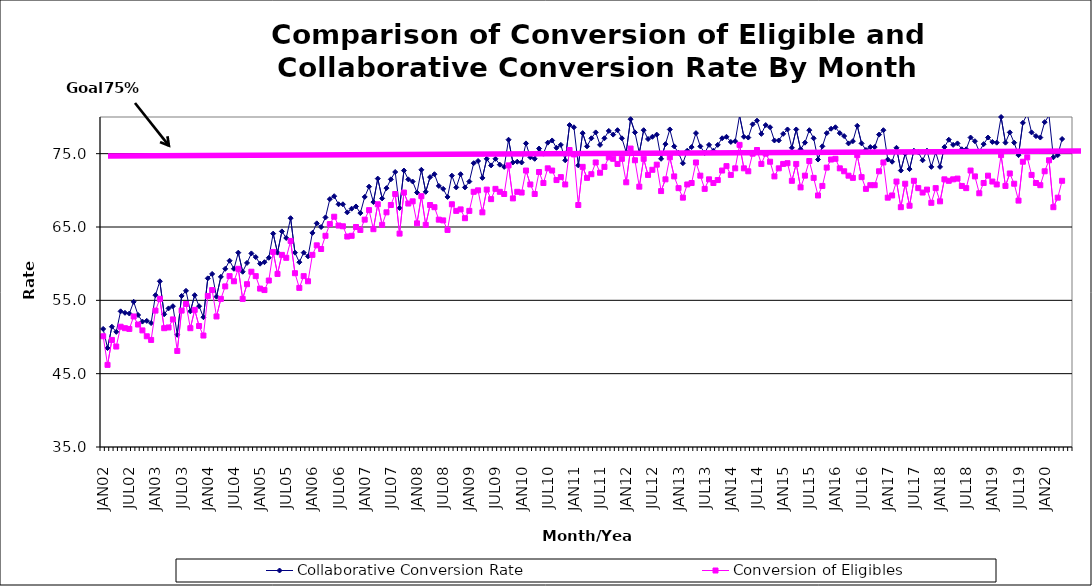
| Category | Collaborative Conversion Rate | Conversion of Eligibles |
|---|---|---|
| JAN02 | 51.1 | 50.1 |
| FEB02 | 48.5 | 46.2 |
| MAR02 | 51.4 | 49.6 |
| APR02 | 50.7 | 48.7 |
| MAY02 | 53.5 | 51.4 |
| JUN02 | 53.3 | 51.2 |
| JUL02 | 53.2 | 51.1 |
| AUG02 | 54.8 | 52.8 |
| SEP02 | 53 | 51.7 |
| OCT02 | 52.1 | 50.9 |
| NOV02 | 52.2 | 50.1 |
| DEC02 | 51.9 | 49.6 |
| JAN03 | 55.7 | 53.6 |
| FEB03 | 57.6 | 55.2 |
| MAR03 | 53.1 | 51.2 |
| APR03 | 53.9 | 51.3 |
| MAY03 | 54.2 | 52.4 |
| JUN03 | 50.3 | 48.1 |
| JUL03 | 55.6 | 53.6 |
| AUG03 | 56.3 | 54.5 |
| SEP03 | 53.5 | 51.2 |
| OCT03 | 55.7 | 53.7 |
| NOV03 | 54.2 | 51.5 |
| DEC03 | 52.7 | 50.2 |
| JAN04 | 58 | 55.6 |
| FEB04 | 58.6 | 56.4 |
| MAR04 | 55.5 | 52.8 |
| APR04 | 58.2 | 55.2 |
| MAY04 | 59.3 | 56.9 |
| JUN04 | 60.4 | 58.3 |
| JUL04 | 59.3 | 57.6 |
| AUG04 | 61.5 | 59.3 |
| SEP04 | 58.9 | 55.2 |
| OCT04 | 60.1 | 57.2 |
| NOV04 | 61.4 | 58.9 |
| DEC04 | 60.9 | 58.3 |
| JAN05 | 60 | 56.6 |
| FEB05 | 60.2 | 56.4 |
| MAR05 | 60.8 | 57.7 |
| APR05 | 64.1 | 61.6 |
| MAY05 | 61.5 | 58.6 |
| JUN05 | 64.4 | 61.2 |
| JUL05 | 63.5 | 60.8 |
| AUG05 | 66.2 | 63.1 |
| SEP05 | 61.5 | 58.7 |
| OCT05 | 60.2 | 56.7 |
| NOV05 | 61.5 | 58.3 |
| DEC05 | 61 | 57.6 |
| JAN06 | 64.2 | 61.2 |
| FEB06 | 65.5 | 62.5 |
| MAR06 | 65 | 62 |
| APR06 | 66.3 | 63.8 |
| MAY06 | 68.8 | 65.4 |
| JUN06 | 69.2 | 66.4 |
| JUL06 | 68.1 | 65.2 |
| AUG06 | 68.1 | 65.1 |
| SEP06 | 67 | 63.7 |
| OCT06 | 67.5 | 63.8 |
| NOV06 | 67.8 | 65 |
| DEC06 | 66.9 | 64.6 |
| JAN07 | 69.1 | 66 |
| FEB07 | 70.5 | 67.3 |
| MAR07 | 68.4 | 64.7 |
| APR07 | 71.6 | 68.1 |
| MAY07 | 68.9 | 65.3 |
| JUN07 | 70.3 | 67 |
| JUL07 | 71.5 | 68 |
| AUG07 | 72.5 | 69.5 |
| SEP07 | 67.6 | 64.1 |
| OCT07 | 72.7 | 69.7 |
| NOV07 | 71.5 | 68.2 |
| DEC07 | 71.2 | 68.5 |
| JAN08 | 69.7 | 65.5 |
| FEB08 | 72.8 | 69.2 |
| MAR08 | 69.8 | 65.3 |
| APR08 | 71.8 | 68 |
| MAY08 | 72.2 | 67.7 |
| JUN08 | 70.6 | 66 |
| JUL08 | 70.2 | 65.9 |
| AUG08 | 69.1 | 64.6 |
| SEP08 | 72 | 68.1 |
| OCT08 | 70.4 | 67.2 |
| NOV08 | 72.2 | 67.4 |
| DEC08 | 70.4 | 66.2 |
| JAN09 | 71.2 | 67.2 |
| FEB09 | 73.7 | 69.8 |
| MAR09 | 74 | 70 |
| APR09 | 71.7 | 67 |
| MAY09 | 74.3 | 70.1 |
| JUN09 | 73.4 | 68.8 |
| JUL09 | 74.3 | 70.2 |
| AUG09 | 73.5 | 69.8 |
| SEP09 | 73.2 | 69.5 |
| OCT09 | 76.9 | 73.4 |
| NOV09 | 73.8 | 68.9 |
| DEC09 | 73.9 | 69.8 |
| JAN10 | 73.8 | 69.7 |
| FEB10 | 76.4 | 72.7 |
| MAR10 | 74.5 | 70.8 |
| APR10 | 74.3 | 69.5 |
| MAY10 | 75.7 | 72.5 |
| JUN10 | 75 | 71 |
| JUL10 | 76.5 | 73 |
| AUG10 | 76.8 | 72.7 |
| SEP10 | 75.8 | 71.4 |
| OCT10 | 76.2 | 71.8 |
| NOV10 | 74.1 | 70.8 |
| DEC10 | 78.9 | 75.5 |
| JAN11 | 78.6 | 74.9 |
| FEB11 | 73.4 | 68 |
| MAR11 | 77.8 | 73.2 |
| APR11 | 76 | 71.7 |
| MAY11 | 77.1 | 72.2 |
| JUN11 | 77.9 | 73.8 |
| JUL11 | 76.2 | 72.4 |
| AUG11 | 77.1 | 73.2 |
| SEP11 | 78.1 | 74.5 |
| OCT11 | 77.6 | 74.3 |
| NOV11 | 78.2 | 73.6 |
| DEC11 | 77.1 | 74.3 |
| JAN12 | 75.2 | 71.1 |
| FEB12 | 79.7 | 75.7 |
| MAR12 | 77.9 | 74.1 |
| APR12 | 75.1 | 70.5 |
| MAY12 | 78.2 | 74.3 |
| JUN12 | 77 | 72.1 |
| JUL12 | 77.3 | 72.8 |
| AUG12 | 77.6 | 73.5 |
| SEP12 | 74.3 | 69.9 |
| OCT12 | 76.3 | 71.5 |
| NOV12 | 78.3 | 74.5 |
| DEC12 | 76 | 71.9 |
| JAN13 | 75.1 | 70.3 |
| FEB13 | 73.7 | 69 |
| MAR13 | 75.4 | 70.8 |
| APR13 | 75.9 | 71 |
| MAY13 | 77.8 | 73.8 |
| JUN13 | 76 | 72 |
| JUL13 | 75.1 | 70.2 |
| AUG13 | 76.2 | 71.5 |
| SEP13 | 75.4 | 71 |
| OCT13 | 76.2 | 71.4 |
| NOV13 | 77.1 | 72.7 |
| DEC13 | 77.3 | 73.3 |
| JAN14 | 76.6 | 72.1 |
| FEB14 | 76.7 | 73 |
| MAR14 | 80.2 | 76.2 |
| APR14 | 77.3 | 73 |
| MAY14 | 77.2 | 72.6 |
| JUN14 | 79 | 75 |
| JUL14 | 79.5 | 75.5 |
| AUG14 | 77.7 | 73.6 |
| SEP14 | 78.9 | 75 |
| OCT14 | 78.6 | 73.9 |
| NOV14 | 76.8 | 71.9 |
| DEC14 | 76.8 | 73 |
| JAN15 | 77.7 | 73.6 |
| FEB15 | 78.3 | 73.7 |
| MAR15 | 75.8 | 71.3 |
| APR15 | 78.3 | 73.6 |
| MAY15 | 75.6 | 70.4 |
| JUN15 | 76.5 | 72 |
| JUL15 | 78.2 | 74 |
| AUG15 | 77.1 | 71.7 |
| SEP15 | 74.2 | 69.3 |
| OCT15 | 76 | 70.6 |
| NOV15 | 77.8 | 73.1 |
| DEC15 | 78.4 | 74.2 |
| JAN16 | 78.6 | 74.3 |
| FEB16 | 77.8 | 73 |
| MAR16 | 77.4 | 72.6 |
| APR16 | 76.4 | 72 |
| MAY16 | 76.7 | 71.7 |
| JUN16 | 78.8 | 74.8 |
| JUL16 | 76.4 | 71.8 |
| AUG16 | 75.5 | 70.2 |
| SEP16 | 75.9 | 70.7 |
| OCT16 | 75.9 | 70.7 |
| NOV16 | 77.6 | 72.6 |
| DEC16 | 78.2 | 73.8 |
| JAN17 | 74.2 | 69 |
| FEB17 | 73.9 | 69.3 |
| MAR17 | 75.8 | 71.2 |
| APR17 | 72.7 | 67.7 |
| MAY17 | 75 | 70.9 |
| JUN17 | 72.9 | 67.9 |
| JUL17 | 75.4 | 71.3 |
| AUG17 | 75.2 | 70.3 |
| SEP17 | 74.1 | 69.7 |
| OCT17 | 75.4 | 70.1 |
| NOV17 | 73.2 | 68.3 |
| DEC17 | 75.2 | 70.3 |
| JAN18 | 73.2 | 68.5 |
| FEB18 | 75.9 | 71.5 |
| MAR18 | 76.9 | 71.3 |
| APR18 | 76.2 | 71.5 |
| MAY18 | 76.4 | 71.6 |
| JUN18 | 75.6 | 70.6 |
| JUL18 | 75.6 | 70.3 |
| AUG18 | 77.2 | 72.7 |
| SEP18 | 76.7 | 71.9 |
| OCT18 | 75.3 | 69.6 |
| NOV18 | 76.3 | 71 |
| DEC18 | 77.2 | 72 |
| JAN19 | 76.6 | 71.2 |
| FEB19 | 76.5 | 70.8 |
| MAR19 | 80 | 74.8 |
| APR19 | 76.5 | 70.6 |
| MAY19 | 77.9 | 72.3 |
| JUN19 | 76.5 | 70.9 |
| JUL19 | 74.8 | 68.6 |
| AUG19 | 79.2 | 73.9 |
| SEP19 | 80.4 | 74.5 |
| OCT19 | 77.9 | 72.1 |
| NOV19 | 77.4 | 71 |
| DEC19 | 77.2 | 70.7 |
| JAN20 | 79.3 | 72.6 |
| FEB20 | 80.2 | 74.1 |
| MAR20 | 74.5 | 67.7 |
| APR20 | 74.8 | 69 |
| MAY20 | 77 | 71.3 |